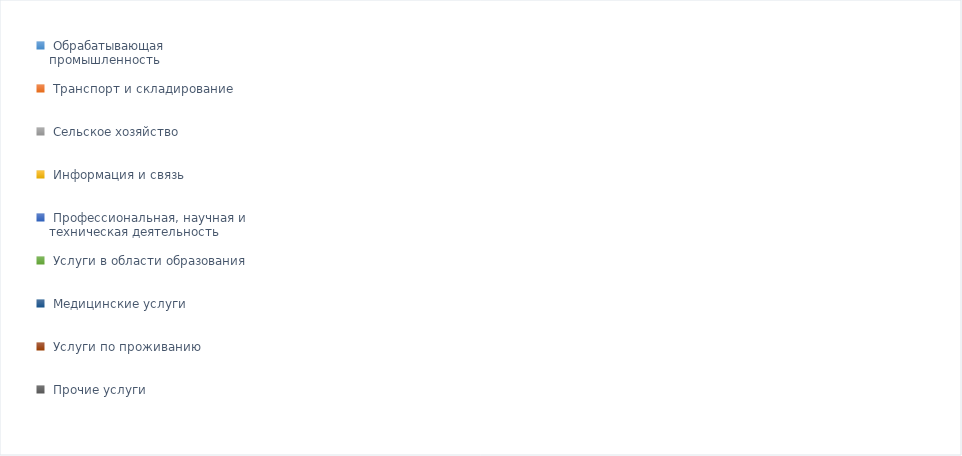
| Category | Series 0 |
|---|---|
| Обрабатывающая промышленность | 0.393 |
| Транспорт и складирование | 0.14 |
| Сельское хозяйство | 0.09 |
| Информация и связь | 0.007 |
| Профессиональная, научная и техническая деятельность | 0.014 |
| Услуги в области образования | 0.056 |
| Медицинские услуги | 0.066 |
| Услуги по проживанию | 0.051 |
| Прочие услуги | 0.184 |